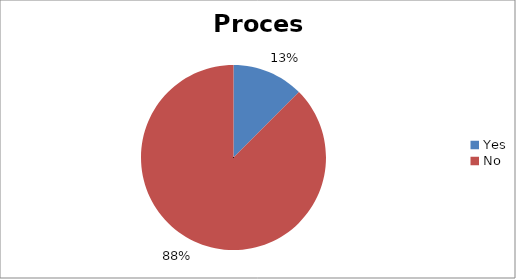
| Category | Process |
|---|---|
| Yes | 1 |
| No | 7 |